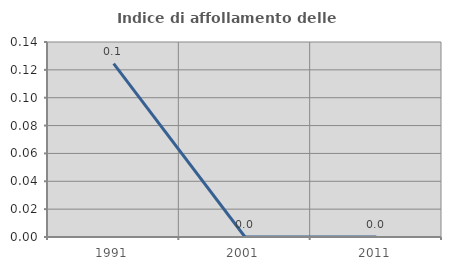
| Category | Indice di affollamento delle abitazioni  |
|---|---|
| 1991.0 | 0.125 |
| 2001.0 | 0 |
| 2011.0 | 0 |